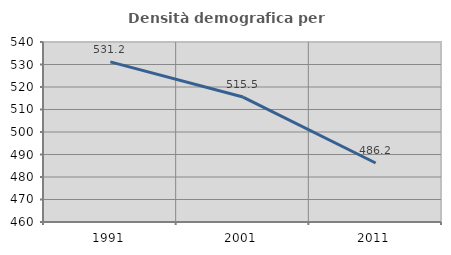
| Category | Densità demografica |
|---|---|
| 1991.0 | 531.179 |
| 2001.0 | 515.533 |
| 2011.0 | 486.223 |